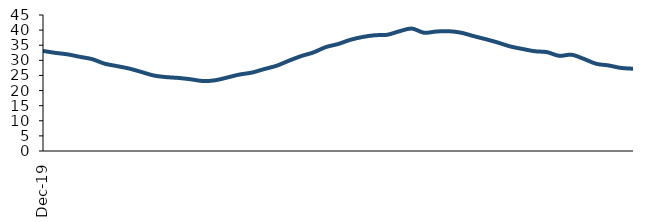
| Category | Series 0 |
|---|---|
| 2019-12-01 | 33.123 |
| 2020-01-01 | 32.469 |
| 2020-02-01 | 31.976 |
| 2020-03-01 | 31.156 |
| 2020-04-01 | 30.392 |
| 2020-05-01 | 28.913 |
| 2020-06-01 | 28.108 |
| 2020-07-01 | 27.29 |
| 2020-08-01 | 26.155 |
| 2020-09-01 | 24.984 |
| 2020-10-01 | 24.457 |
| 2020-11-01 | 24.181 |
| 2020-12-01 | 23.74 |
| 2021-01-01 | 23.158 |
| 2021-02-01 | 23.396 |
| 2021-03-01 | 24.331 |
| 2021-04-01 | 25.306 |
| 2021-05-01 | 25.953 |
| 2021-06-01 | 27.111 |
| 2021-07-01 | 28.2 |
| 2021-08-01 | 29.868 |
| 2021-09-01 | 31.404 |
| 2021-10-01 | 32.611 |
| 2021-11-01 | 34.373 |
| 2021-12-01 | 35.387 |
| 2022-01-01 | 36.784 |
| 2022-02-01 | 37.727 |
| 2022-03-01 | 38.303 |
| 2022-04-01 | 38.455 |
| 2022-05-01 | 39.626 |
| 2022-06-01 | 40.515 |
| 2022-07-01 | 39.14 |
| 2022-08-01 | 39.529 |
| 2022-09-01 | 39.638 |
| 2022-10-01 | 39.158 |
| 2022-11-01 | 38.048 |
| 2022-12-01 | 37.019 |
| 2023-01-01 | 35.89 |
| 2023-02-01 | 34.611 |
| 2023-03-01 | 33.773 |
| 2023-04-01 | 33.011 |
| 2023-05-01 | 32.711 |
| 2023-06-01 | 31.485 |
| 2023-07-01 | 31.855 |
| 2023-08-01 | 30.473 |
| 2023-09-01 | 28.864 |
| 2023-10-01 | 28.318 |
| 2023-11-01 | 27.504 |
| 2023-12-01 | 27.222 |